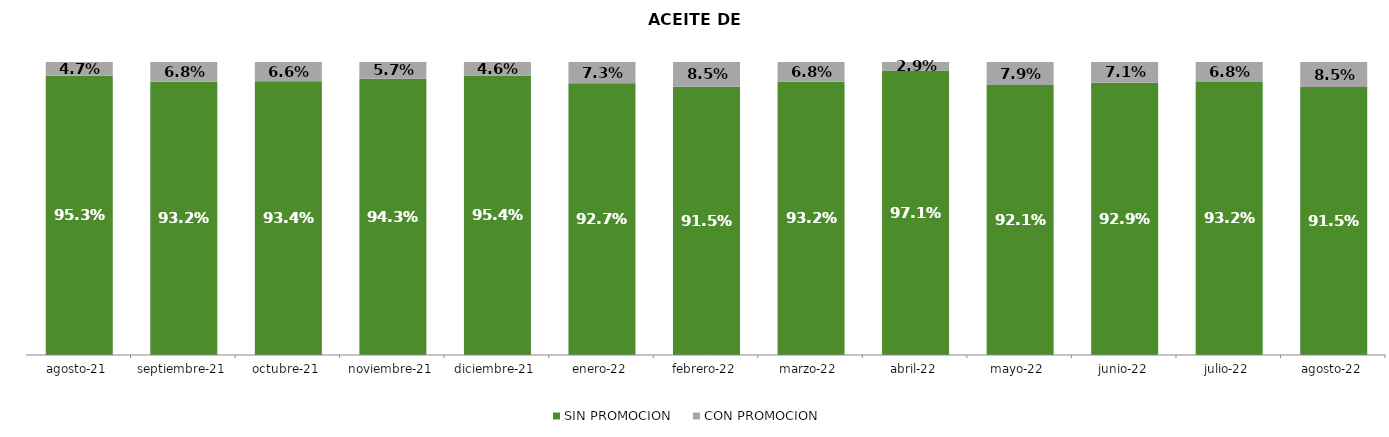
| Category | SIN PROMOCION   | CON PROMOCION   |
|---|---|---|
| 2021-08-01 | 0.953 | 0.047 |
| 2021-09-01 | 0.932 | 0.068 |
| 2021-10-01 | 0.934 | 0.066 |
| 2021-11-01 | 0.943 | 0.057 |
| 2021-12-01 | 0.954 | 0.046 |
| 2022-01-01 | 0.927 | 0.073 |
| 2022-02-01 | 0.915 | 0.085 |
| 2022-03-01 | 0.932 | 0.068 |
| 2022-04-01 | 0.971 | 0.029 |
| 2022-05-01 | 0.921 | 0.079 |
| 2022-06-01 | 0.929 | 0.071 |
| 2022-07-01 | 0.932 | 0.068 |
| 2022-08-01 | 0.915 | 0.085 |